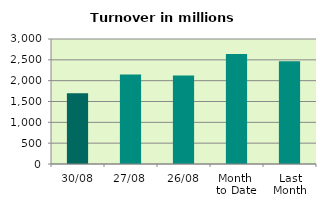
| Category | Series 0 |
|---|---|
| 30/08 | 1695.63 |
| 27/08 | 2146.474 |
| 26/08 | 2121.705 |
| Month 
to Date | 2637.122 |
| Last
Month | 2466.495 |